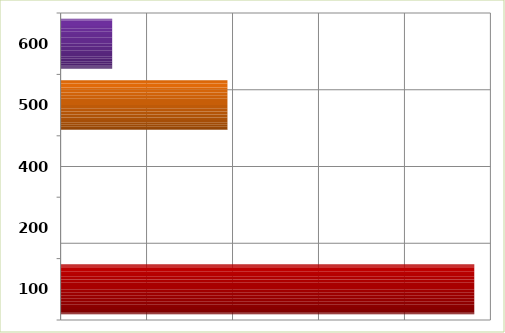
| Category | Series 0 |
|---|---|
| 100.0 | 24062396 |
| 200.0 | 0 |
| 400.0 | 0 |
| 500.0 | 9705000 |
| 600.0 | 3000000 |